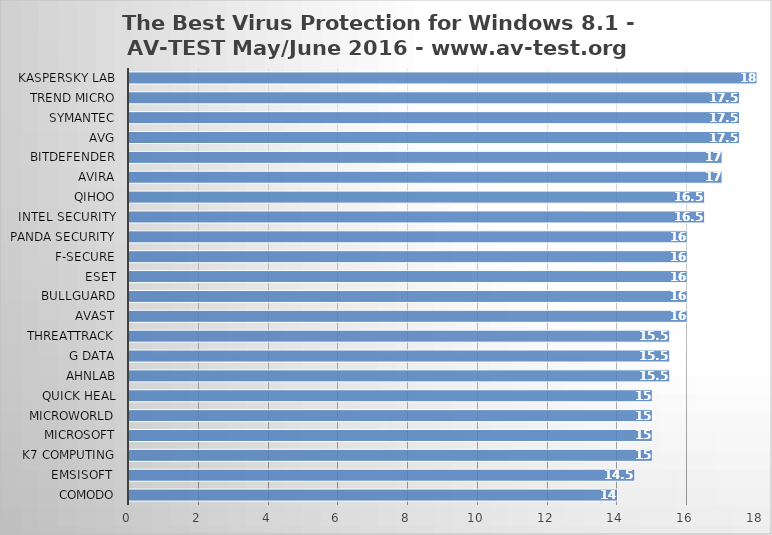
| Category | Series 0 |
|---|---|
| Comodo | 14 |
| Emsisoft  | 14.5 |
| K7 Computing | 15 |
| Microsoft | 15 |
| Microworld | 15 |
| Quick Heal | 15 |
| AhnLab | 15.5 |
| G Data | 15.5 |
| ThreatTrack | 15.5 |
| Avast | 16 |
| BullGuard | 16 |
| ESET | 16 |
| F-Secure | 16 |
| Panda Security | 16 |
| Intel Security | 16.5 |
| Qihoo | 16.5 |
| Avira | 17 |
| Bitdefender | 17 |
| AVG | 17.5 |
| Symantec | 17.5 |
| Trend Micro | 17.5 |
| Kaspersky Lab | 18 |